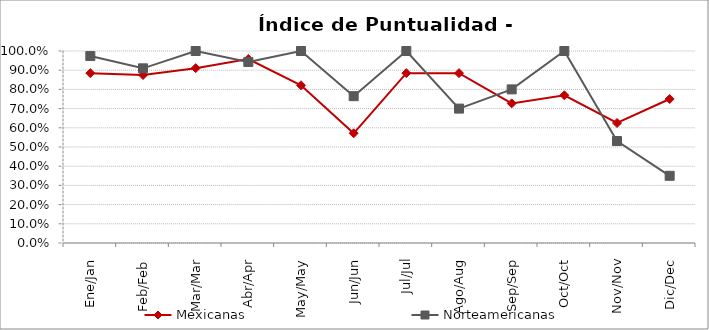
| Category | Mexicanas | Norteamericanas |
|---|---|---|
| Ene/Jan | 0.885 | 0.974 |
| Feb/Feb | 0.875 | 0.91 |
| Mar/Mar | 0.911 | 1 |
| Abr/Apr | 0.958 | 0.943 |
| May/May | 0.821 | 1 |
| Jun/Jun | 0.571 | 0.765 |
| Jul/Jul | 0.885 | 1 |
| Ago/Aug | 0.885 | 0.7 |
| Sep/Sep | 0.727 | 0.8 |
| Oct/Oct | 0.769 | 1 |
| Nov/Nov | 0.625 | 0.531 |
| Dic/Dec | 0.75 | 0.35 |